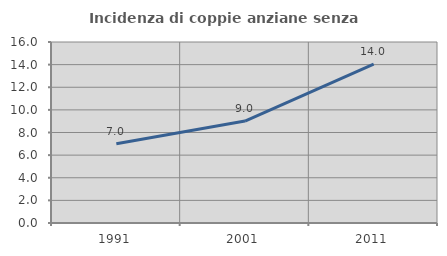
| Category | Incidenza di coppie anziane senza figli  |
|---|---|
| 1991.0 | 7.003 |
| 2001.0 | 9.009 |
| 2011.0 | 14.041 |